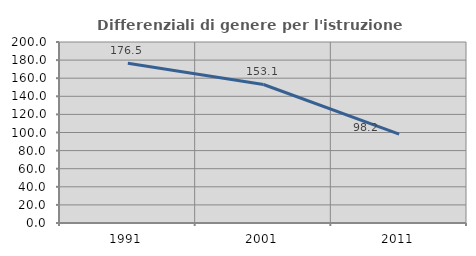
| Category | Differenziali di genere per l'istruzione superiore |
|---|---|
| 1991.0 | 176.479 |
| 2001.0 | 153.069 |
| 2011.0 | 98.2 |